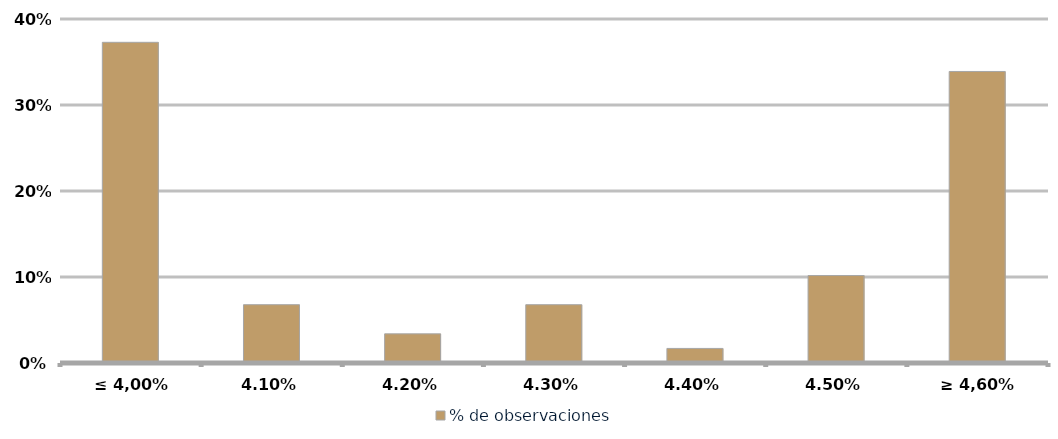
| Category | % de observaciones  |
|---|---|
| ≤ 4,00% | 0.373 |
| 4,10% | 0.068 |
| 4,20% | 0.034 |
| 4,30% | 0.068 |
| 4,40% | 0.017 |
| 4,50% | 0.102 |
| ≥ 4,60% | 0.339 |